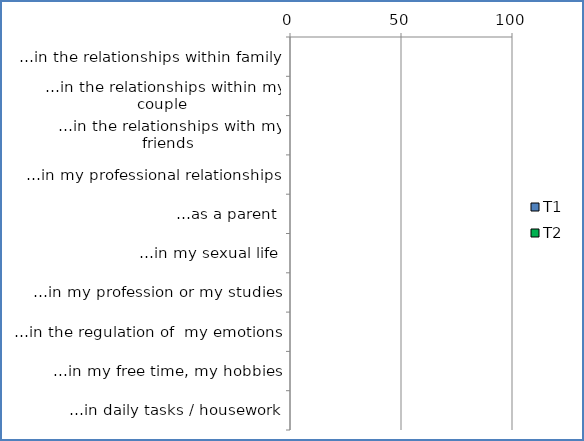
| Category | T1 | T2 |
|---|---|---|
| …in the relationships within family | 0 | 0 |
| …in the relationships within my couple | 0 | 0 |
| …in the relationships with my friends | 0 | 0 |
| …in my professional relationships | 0 | 0 |
| …as a parent | 0 | 0 |
| …in my sexual life | 0 | 0 |
| …in my profession or my studies | 0 | 0 |
| …in the regulation of  my emotions | 0 | 0 |
| ...in my free time, my hobbies | 0 | 0 |
| …in daily tasks / housework | 0 | 0 |